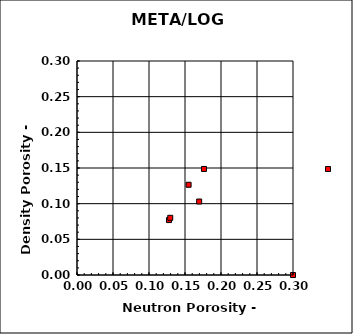
| Category | Series 0 |
|---|---|
| 0.3 | 0 |
| 0.12925 | -0.05 |
| 0.1278 | 0.077 |
| 0.169666666666667 | 0.103 |
| 0.176333333333333 | 0.149 |
| 0.155 | 0.126 |
| 0.1295 | 0.08 |